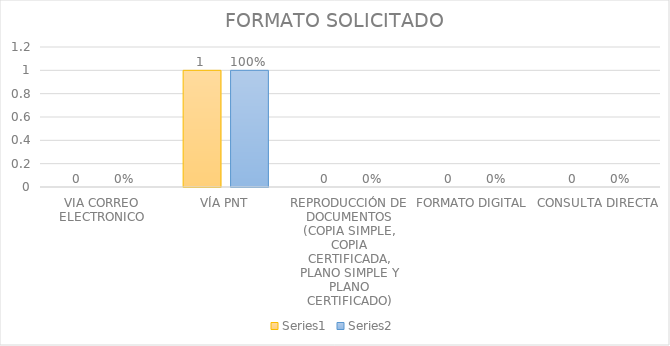
| Category | Series 3 | Series 4 |
|---|---|---|
| VIA CORREO ELECTRONICO | 0 | 0 |
| VÍA PNT | 1 | 1 |
| REPRODUCCIÓN DE DOCUMENTOS (COPIA SIMPLE, COPIA CERTIFICADA, PLANO SIMPLE Y PLANO CERTIFICADO) | 0 | 0 |
| FORMATO DIGITAL | 0 | 0 |
| CONSULTA DIRECTA | 0 | 0 |